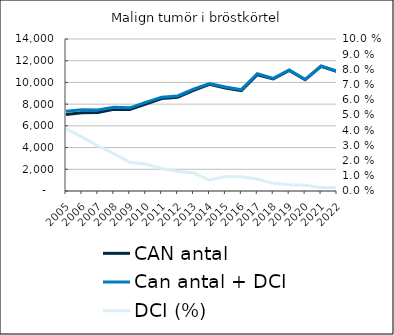
| Category |  CAN antal  |  Can antal + DCI  |
|---|---|---|
| 2005.0 | 7054 | 7343 |
| 2006.0 | 7215 | 7472 |
| 2007.0 | 7238 | 7453 |
| 2008.0 | 7518 | 7703 |
| 2009.0 | 7515 | 7657 |
| 2010.0 | 8017 | 8160 |
| 2011.0 | 8519 | 8645 |
| 2012.0 | 8644 | 8755 |
| 2013.0 | 9266 | 9377 |
| 2014.0 | 9829 | 9900 |
| 2015.0 | 9484 | 9574 |
| 2016.0 | 9248 | 9335 |
| 2017.0 | 10710 | 10795 |
| 2018.0 | 10319 | 10371 |
| 2019.0 | 11095 | 11141 |
| 2020.0 | 10243 | 10282 |
| 2021.0 | 11483 | 11509 |
| 2022.0 | 11014 | 11040 |